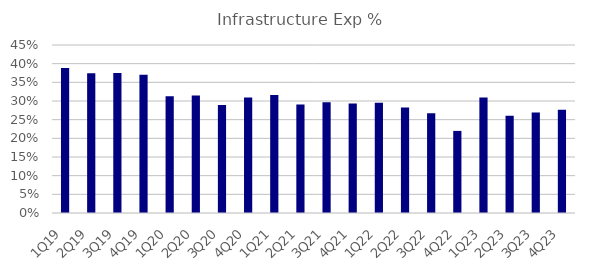
| Category | Infrastructure Exp % |
|---|---|
| 1Q19 | 0.388 |
| 2Q19 | 0.374 |
| 3Q19 | 0.375 |
| 4Q19 | 0.371 |
| 1Q20 | 0.313 |
| 2Q20 | 0.315 |
| 3Q20 | 0.29 |
| 4Q20 | 0.309 |
| 1Q21 | 0.316 |
| 2Q21 | 0.29 |
| 3Q21 | 0.296 |
| 4Q21 | 0.293 |
| 1Q22 | 0.295 |
| 2Q22 | 0.282 |
| 3Q22 | 0.267 |
| 4Q22 | 0.22 |
| 1Q23 | 0.31 |
| 2Q23 | 0.261 |
| 3Q23 | 0.269 |
| 4Q23 | 0.277 |